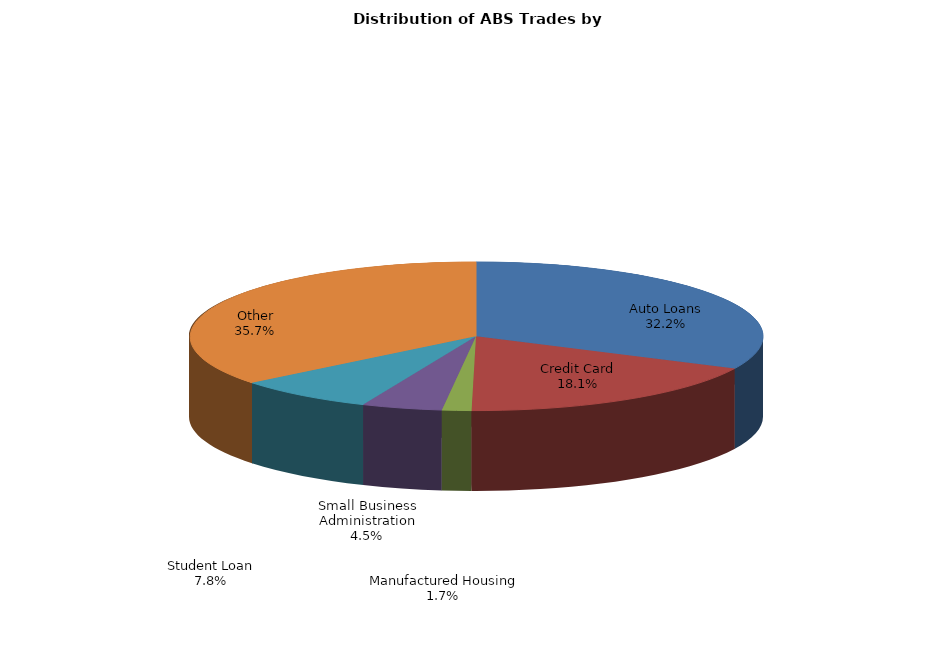
| Category | Series 0 |
|---|---|
| Auto Loans | 137.347 |
| Credit Card | 77.231 |
| Manufactured Housing | 7.06 |
| Small Business Administration | 19.331 |
| Student Loan | 33.43 |
| Other | 152.669 |